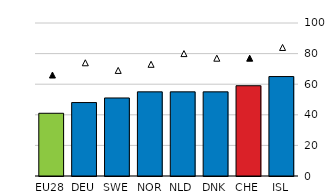
| Category | All |
|---|---|
| EU28 | 41 |
| DEU | 48 |
| SWE | 51 |
| NOR | 55 |
| NLD | 55 |
| DNK | 55 |
| CHE | 59 |
| ISL | 65 |